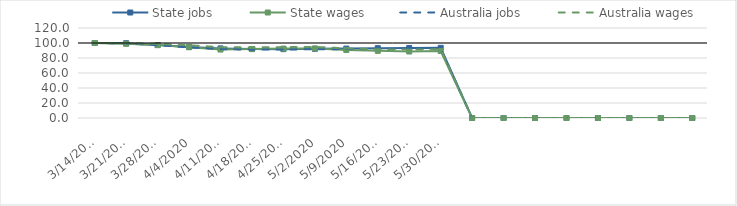
| Category | State jobs | State wages | Australia jobs | Australia wages |
|---|---|---|---|---|
| 14/03/2020 | 100 | 100 | 100 | 100 |
| 21/03/2020 | 99.693 | 98.926 | 99.552 | 99.902 |
| 28/03/2020 | 97.27 | 97.165 | 97.088 | 98.771 |
| 04/04/2020 | 94.591 | 94.385 | 94.15 | 97.007 |
| 11/04/2020 | 92.823 | 91.243 | 91.933 | 94.434 |
| 18/04/2020 | 91.971 | 91.856 | 91.108 | 94.115 |
| 25/04/2020 | 91.801 | 92.544 | 91.306 | 94.452 |
| 02/05/2020 | 92.258 | 92.722 | 91.63 | 94.778 |
| 09/05/2020 | 92.55 | 90.634 | 91.91 | 92.892 |
| 16/05/2020 | 93.108 | 89.543 | 92.165 | 91.712 |
| 23/05/2020 | 93.383 | 88.638 | 92.167 | 91.106 |
| 30/05/2020 | 93.528 | 89.307 | 92.546 | 91.708 |